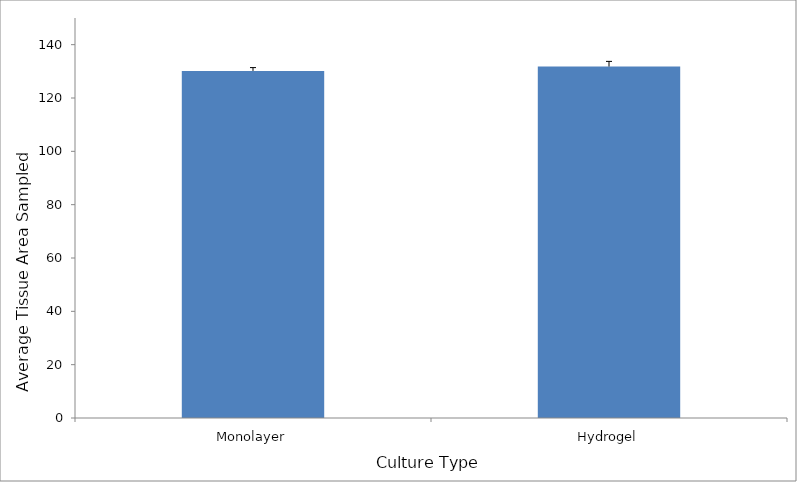
| Category | Average tissue area sampled |
|---|---|
| Monolayer | 130.16 |
| Hydrogel | 131.8 |